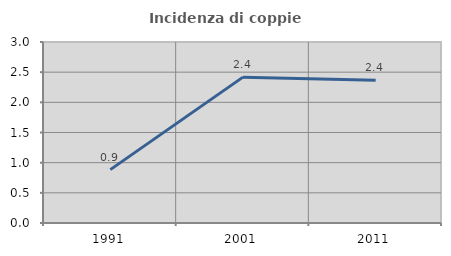
| Category | Incidenza di coppie miste |
|---|---|
| 1991.0 | 0.885 |
| 2001.0 | 2.418 |
| 2011.0 | 2.366 |